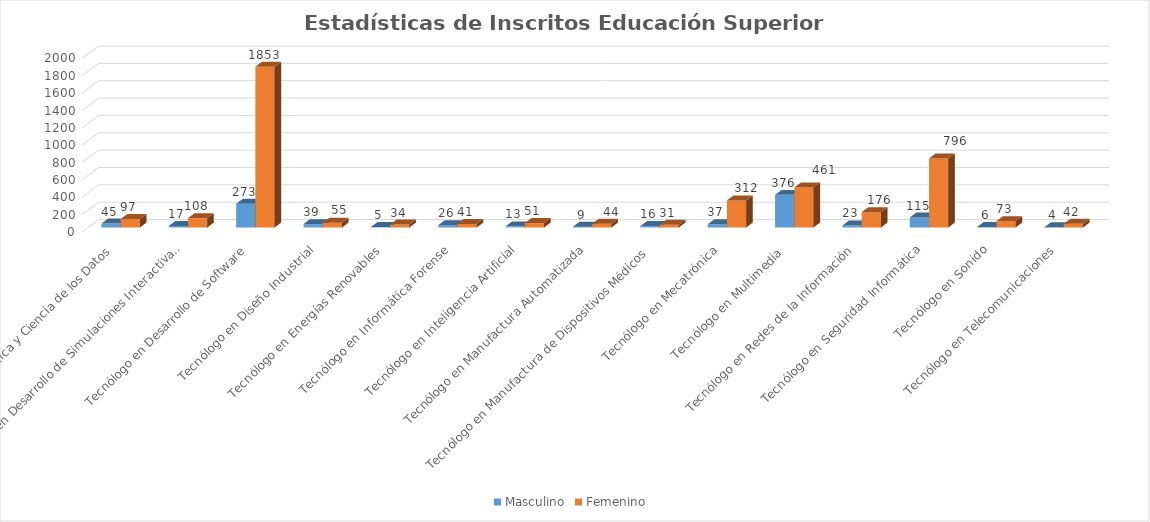
| Category | Masculino | Femenino  |
|---|---|---|
| Tecnólogo en Analítica y Ciencia de los Datos | 45 | 97 |
| Tecnólogo en Desarrollo de Simulaciones Interactivas y Videojuegos | 17 | 108 |
| Tecnólogo en Desarrollo de Software | 273 | 1853 |
| Tecnólogo en Diseño Industrial | 39 | 55 |
| Tecnólogo en Energías Renovables | 5 | 34 |
| Tecnólogo en Informática Forense | 26 | 41 |
| Tecnólogo en Inteligencia Artificial | 13 | 51 |
| Tecnólogo en Manufactura Automatizada | 9 | 44 |
| Tecnólogo en Manufactura de Dispositivos Médicos  | 16 | 31 |
| Tecnólogo en Mecatrónica | 37 | 312 |
| Tecnólogo en Multimedia  | 376 | 461 |
| Tecnólogo en Redes de la Información | 23 | 176 |
| Tecnólogo en Seguridad Informática | 115 | 796 |
| Tecnólogo en Sonido | 6 | 73 |
| Tecnólogo en Telecomunicaciones | 4 | 42 |